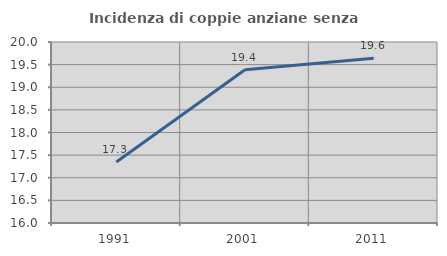
| Category | Incidenza di coppie anziane senza figli  |
|---|---|
| 1991.0 | 17.347 |
| 2001.0 | 19.388 |
| 2011.0 | 19.643 |